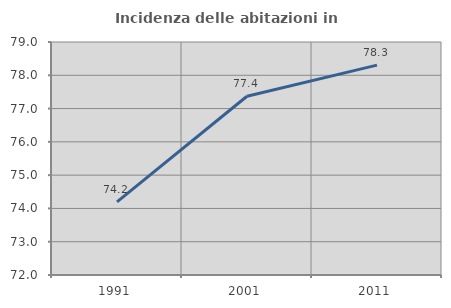
| Category | Incidenza delle abitazioni in proprietà  |
|---|---|
| 1991.0 | 74.196 |
| 2001.0 | 77.37 |
| 2011.0 | 78.306 |